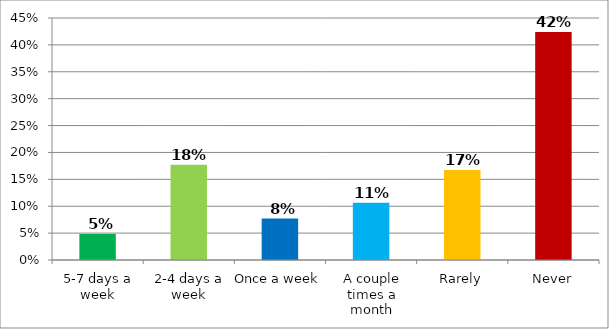
| Category | Responses |
|---|---|
| 5-7 days a week | 0.048 |
| 2-4 days a week | 0.177 |
| Once a week | 0.077 |
| A couple times a month | 0.106 |
| Rarely | 0.167 |
| Never | 0.424 |